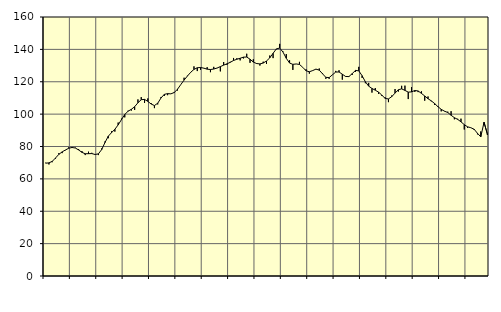
| Category | Piggar | Series 1 |
|---|---|---|
| nan | 70 | 69.7 |
| 87.0 | 68.9 | 69.88 |
| 87.0 | 70.3 | 70.83 |
| 87.0 | 72.5 | 72.91 |
| nan | 75.9 | 75.14 |
| 88.0 | 75.9 | 76.68 |
| 88.0 | 77.7 | 77.84 |
| 88.0 | 79.5 | 78.91 |
| nan | 79.7 | 79.4 |
| 89.0 | 79.3 | 79.06 |
| 89.0 | 78.4 | 77.86 |
| 89.0 | 77.2 | 76.39 |
| nan | 74.7 | 75.53 |
| 90.0 | 76.8 | 75.56 |
| 90.0 | 76.1 | 75.63 |
| 90.0 | 75.2 | 75.07 |
| nan | 74.7 | 75.44 |
| 91.0 | 78.8 | 78.09 |
| 91.0 | 83.1 | 82.44 |
| 91.0 | 85.1 | 86.37 |
| nan | 89.4 | 88.59 |
| 92.0 | 89.2 | 90.64 |
| 92.0 | 94.8 | 93.35 |
| 92.0 | 97.2 | 96.59 |
| nan | 98 | 99.78 |
| 93.0 | 102.1 | 101.79 |
| 93.0 | 102.2 | 102.98 |
| 93.0 | 102.6 | 104.58 |
| nan | 109.1 | 107.02 |
| 94.0 | 110.5 | 108.91 |
| 94.0 | 106.9 | 109.1 |
| 94.0 | 109.7 | 107.88 |
| nan | 106.8 | 106.23 |
| 95.0 | 103.7 | 105.3 |
| 95.0 | 106 | 106.74 |
| 95.0 | 110.6 | 109.98 |
| nan | 111.2 | 112.22 |
| 96.0 | 111.7 | 112.66 |
| 96.0 | 112.5 | 112.52 |
| 96.0 | 113.7 | 113.34 |
| nan | 114.6 | 115.37 |
| 97.0 | 118.2 | 118.25 |
| 97.0 | 122.5 | 121.02 |
| 97.0 | 123.7 | 123.5 |
| nan | 125.7 | 125.83 |
| 98.0 | 129.5 | 127.63 |
| 98.0 | 126.6 | 128.64 |
| 98.0 | 127.4 | 128.81 |
| nan | 128.3 | 128.39 |
| 99.0 | 129 | 127.77 |
| 99.0 | 125.9 | 127.55 |
| 99.0 | 129.2 | 127.85 |
| nan | 128.4 | 128.47 |
| 0.0 | 126.4 | 129.35 |
| 0.0 | 132.2 | 130.27 |
| 0.0 | 130.4 | 131.07 |
| nan | 132.3 | 132 |
| 1.0 | 134.7 | 133.13 |
| 1.0 | 134.5 | 133.89 |
| 1.0 | 133.2 | 134.5 |
| nan | 134.4 | 135.2 |
| 2.0 | 137.3 | 135.27 |
| 2.0 | 131.7 | 133.92 |
| 2.0 | 133.9 | 132.14 |
| nan | 131 | 131.25 |
| 3.0 | 130 | 131.03 |
| 3.0 | 132.4 | 131.55 |
| 3.0 | 131 | 132.81 |
| nan | 136.2 | 134.78 |
| 4.0 | 134.6 | 137.57 |
| 4.0 | 140.1 | 140.3 |
| 4.0 | 143.4 | 140.82 |
| nan | 138.7 | 138.34 |
| 5.0 | 137.1 | 134.5 |
| 5.0 | 133.3 | 131.55 |
| 5.0 | 127.3 | 130.76 |
| nan | 131 | 130.98 |
| 6.0 | 132.3 | 130.7 |
| 6.0 | 128.9 | 128.91 |
| 6.0 | 127.7 | 126.77 |
| nan | 125 | 126.16 |
| 7.0 | 127 | 126.9 |
| 7.0 | 127.9 | 127.79 |
| 7.0 | 128.2 | 127.18 |
| nan | 125.3 | 124.92 |
| 8.0 | 121.8 | 122.73 |
| 8.0 | 121.8 | 122.56 |
| 8.0 | 124.4 | 124.29 |
| nan | 126.7 | 125.99 |
| 9.0 | 127.1 | 126.05 |
| 9.0 | 121.3 | 124.65 |
| 9.0 | 123.4 | 123.26 |
| nan | 123.4 | 123.2 |
| 10.0 | 124.2 | 125.03 |
| 10.0 | 126.1 | 127 |
| 10.0 | 129.2 | 126.73 |
| nan | 122.4 | 123.74 |
| 11.0 | 119.1 | 119.98 |
| 11.0 | 119.3 | 117.27 |
| 11.0 | 113.3 | 115.84 |
| nan | 116.1 | 114.78 |
| 12.0 | 112.5 | 113.58 |
| 12.0 | 111.2 | 111.73 |
| 12.0 | 110.4 | 109.67 |
| nan | 107.4 | 109.4 |
| 13.0 | 111.5 | 110.8 |
| 13.0 | 115.5 | 112.99 |
| 13.0 | 113.9 | 115.07 |
| nan | 117.5 | 115.6 |
| 14.0 | 117.6 | 114.66 |
| 14.0 | 109.3 | 113.59 |
| 14.0 | 116.7 | 113.74 |
| nan | 113.7 | 114.61 |
| 15.0 | 113.6 | 114.31 |
| 15.0 | 114.1 | 112.81 |
| 15.0 | 108.3 | 111.21 |
| nan | 110.9 | 109.52 |
| 16.0 | 107.9 | 108.19 |
| 16.0 | 105.7 | 106.55 |
| 16.0 | 105 | 104.62 |
| nan | 101.7 | 102.95 |
| 17.0 | 101.7 | 101.82 |
| 17.0 | 101.5 | 100.99 |
| 17.0 | 101.8 | 99.3 |
| nan | 96.8 | 97.8 |
| 18.0 | 97.1 | 96.75 |
| 18.0 | 97.2 | 95.26 |
| 18.0 | 90.5 | 93.5 |
| nan | 91.5 | 92.16 |
| 19.0 | 91.6 | 91.61 |
| 19.0 | 90.2 | 90.63 |
| 19.0 | 87.5 | 88.17 |
| nan | 89.3 | 85.96 |
| 20.0 | 93.2 | 94.95 |
| 20.0 | 87.1 | 87.71 |